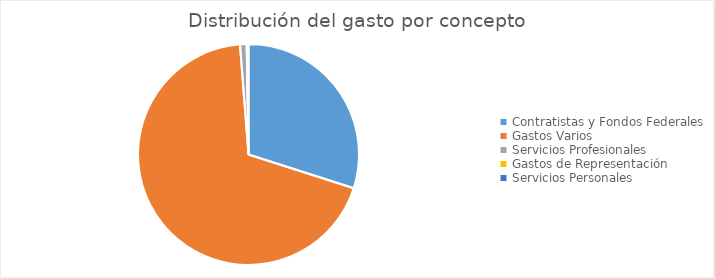
| Category | Series 0 |
|---|---|
| Contratistas y Fondos Federales | 122701751.69 |
| Gastos Varios | 282103555.53 |
| Servicios Profesionales | 3978080.21 |
| Gastos de Representación | 336445.95 |
| Servicios Personales | 737260.33 |